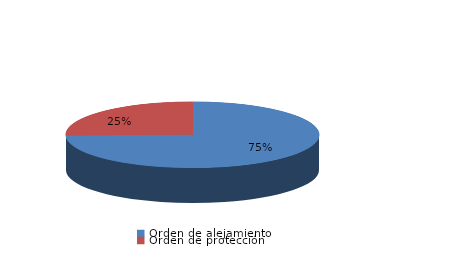
| Category | Series 0 |
|---|---|
| Orden de alejamiento | 110 |
| Orden de protección | 37 |